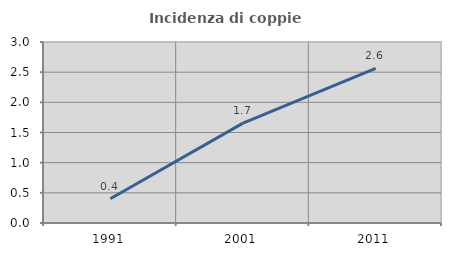
| Category | Incidenza di coppie miste |
|---|---|
| 1991.0 | 0.402 |
| 2001.0 | 1.655 |
| 2011.0 | 2.564 |